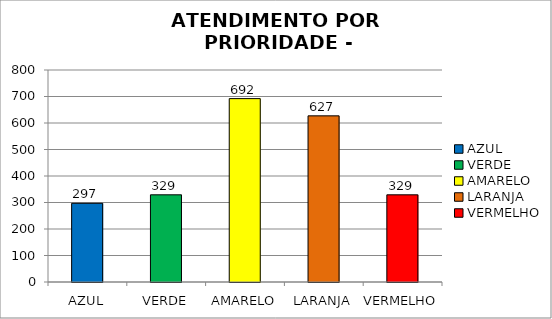
| Category | Total Regional: |
|---|---|
| AZUL | 297 |
| VERDE | 329 |
| AMARELO | 692 |
| LARANJA | 627 |
| VERMELHO | 329 |